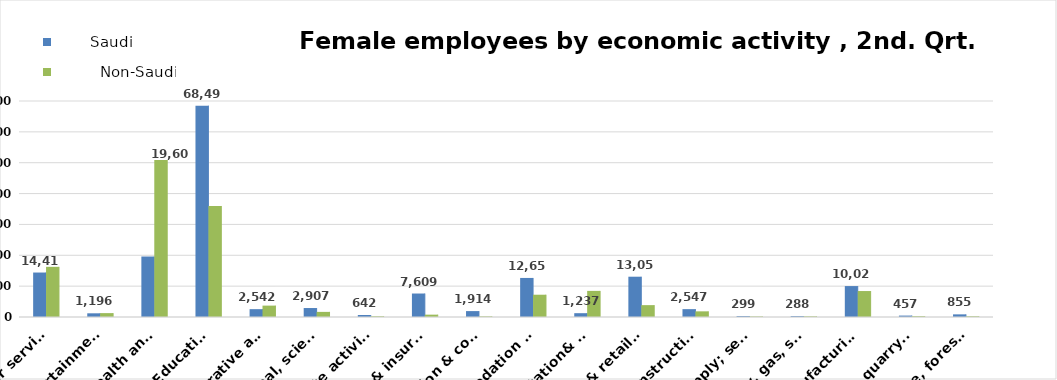
| Category |        Saudi      |          Non-Saudi        |
|---|---|---|
| Agriculture, forestry & fishing | 855 | 238 |
| Mining & quarrying | 457 | 264 |
| Manufacturing | 10024 | 8414 |
| Electricity, gas, steam & air conditioning supply | 288 | 211 |
| Water supply; sewerage, waste remediation  | 299 | 173 |
| Construction | 2547 | 1833 |
| Wholesale& retail trade; repair of motor vehicles | 13059 | 3848 |
| Transportation& storage | 1237 | 8461 |
| Accommodation & food service activities | 12657 | 7221 |
| Information & communication | 1914 | 198 |
| Financial & insurance | 7609 | 759 |
| Real estate activities | 642 | 233 |
| Professional, scientific & technical activities | 2907 | 1658 |
| Administrative and support service activities | 2542 | 3690 |
| Education | 68497 | 35976 |
| Human health and &l work activities | 19603 | 50899 |
| Arts, entertainment & recreation | 1196 | 1258 |
| Other service | 14411 | 16256 |